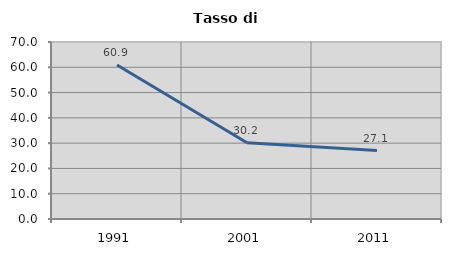
| Category | Tasso di disoccupazione   |
|---|---|
| 1991.0 | 60.937 |
| 2001.0 | 30.16 |
| 2011.0 | 27.057 |